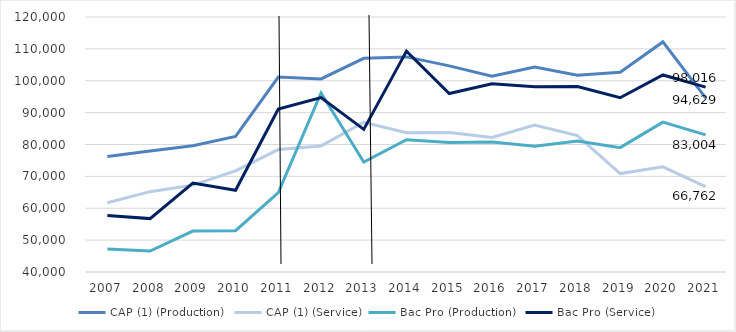
| Category | CAP (1) | Bac Pro |
|---|---|---|
| 2007.0 | 61731 | 57730 |
| 2008.0 | 65209 | 56750 |
| 2009.0 | 67258 | 67883 |
| 2010.0 | 71712 | 65635 |
| 2011.0 | 78407 | 91135 |
| 2012.0 | 79555 | 94708 |
| 2013.0 | 86976 | 84741 |
| 2014.0 | 83722 | 109294 |
| 2015.0 | 83729 | 95996 |
| 2016.0 | 82227 | 99075 |
| 2017.0 | 86069 | 98103 |
| 2018.0 | 82806 | 98171 |
| 2019.0 | 70870.009 | 94665 |
| 2020.0 | 72985 | 101822 |
| 2021.0 | 66762 | 98016 |